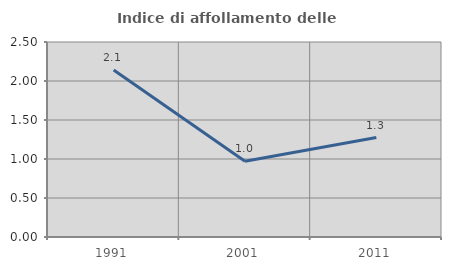
| Category | Indice di affollamento delle abitazioni  |
|---|---|
| 1991.0 | 2.141 |
| 2001.0 | 0.972 |
| 2011.0 | 1.276 |